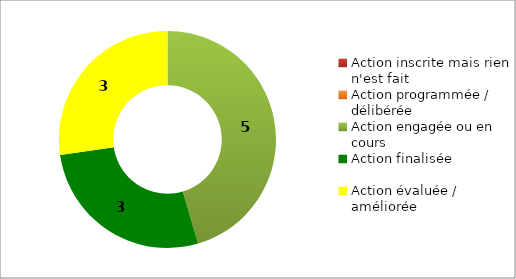
| Category | Series 0 |
|---|---|
| Action inscrite mais rien n'est fait | 0 |
| Action programmée / délibérée | 0 |
| Action engagée ou en cours | 5 |
| Action finalisée | 3 |
| Action évaluée / améliorée | 3 |